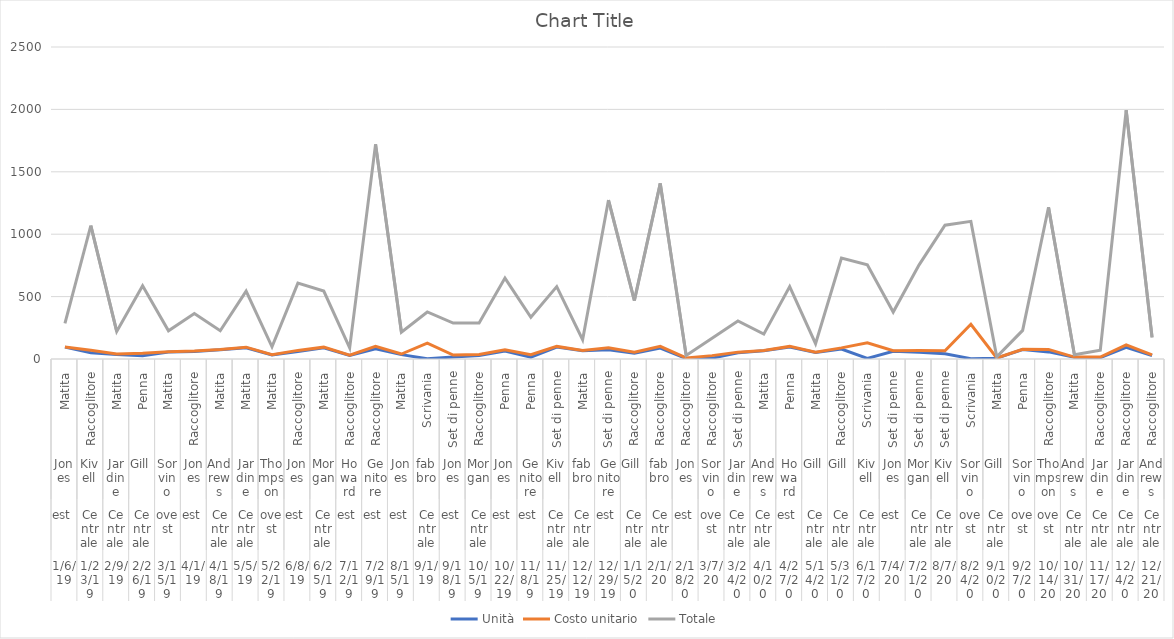
| Category | Units | Unit Cost | Total |
|---|---|---|---|
| 0 | 95 | 1.99 | 189.05 |
| 1 | 50 | 19.99 | 999.5 |
| 2 | 36 | 4.99 | 179.64 |
| 3 | 27 | 19.99 | 539.73 |
| 4 | 56 | 2.99 | 167.44 |
| 5 | 60 | 4.99 | 299.4 |
| 6 | 75 | 1.99 | 149.25 |
| 7 | 90 | 4.99 | 449.1 |
| 8 | 32 | 1.99 | 63.68 |
| 9 | 60 | 8.99 | 539.4 |
| 10 | 90 | 4.99 | 449.1 |
| 11 | 29 | 1.99 | 57.71 |
| 12 | 81 | 19.99 | 1619.19 |
| 13 | 35 | 4.99 | 174.65 |
| 14 | 2 | 125 | 250 |
| 15 | 16 | 15.99 | 255.84 |
| 16 | 28 | 8.99 | 251.72 |
| 17 | 64 | 8.99 | 575.36 |
| 18 | 15 | 19.99 | 299.85 |
| 19 | 96 | 4.99 | 479.04 |
| 20 | 67 | 1.29 | 86.43 |
| 21 | 74 | 15.99 | 1183.26 |
| 22 | 46 | 8.99 | 413.54 |
| 23 | 87 | 15 | 1305 |
| 24 | 4 | 4.99 | 19.96 |
| 25 | 7 | 19.99 | 139.93 |
| 26 | 50 | 4.99 | 249.5 |
| 27 | 66 | 1.99 | 131.34 |
| 28 | 96 | 4.99 | 479.04 |
| 29 | 53 | 1.29 | 68.37 |
| 30 | 80 | 8.99 | 719.2 |
| 31 | 5 | 125 | 625 |
| 32 | 62 | 4.99 | 309.38 |
| 33 | 55 | 12.49 | 686.95 |
| 34 | 42 | 23.95 | 1005.9 |
| 35 | 3 | 275 | 825 |
| 36 | 7 | 1.29 | 9.03 |
| 37 | 76 | 1.99 | 151.24 |
| 38 | 57 | 19.99 | 1139.43 |
| 39 | 14 | 1.29 | 18.06 |
| 40 | 11 | 4.99 | 54.89 |
| 41 | 94 | 19.99 | 1879.06 |
| 42 | 28 | 4.99 | 139.72 |